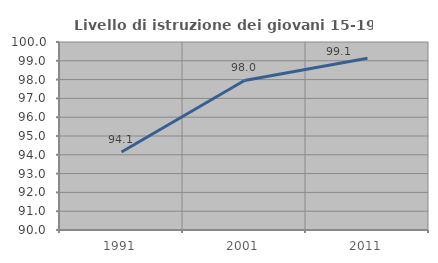
| Category | Livello di istruzione dei giovani 15-19 anni |
|---|---|
| 1991.0 | 94.148 |
| 2001.0 | 97.953 |
| 2011.0 | 99.13 |